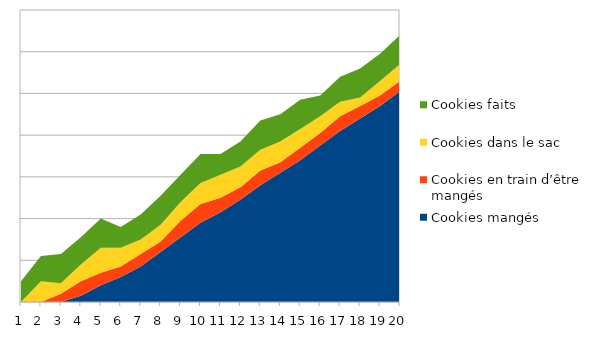
| Category | Cookies mangés | Cookies en train d’être mangés | Cookies dans le sac  | Cookies faits |
|---|---|---|---|---|
| 1 | 0 | 0 | 0 | 10 |
| 2 | 0 | 0 | 10 | 12 |
| 3 | 0 | 4 | 5 | 14 |
| 4 | 3 | 7 | 8 | 13 |
| 5 | 8 | 6 | 12 | 14 |
| 6 | 12 | 5 | 9 | 10 |
| 7 | 17 | 6 | 7 | 12 |
| 8 | 24 | 5 | 8 | 14 |
| 9 | 31 | 8 | 9 | 13 |
| 10 | 38 | 9 | 10 | 14 |
| 11 | 43 | 7 | 11 | 10 |
| 12 | 49 | 6 | 10 | 12 |
| 13 | 56 | 7 | 10 | 14 |
| 14 | 62 | 5 | 10 | 13 |
| 15 | 68 | 6 | 9 | 14 |
| 16 | 75 | 6 | 8 | 10 |
| 17 | 82 | 7 | 7 | 12 |
| 18 | 88 | 6 | 4 | 14 |
| 19 | 94 | 5 | 7 | 13 |
| 20 | 101 | 5 | 8 | 14 |